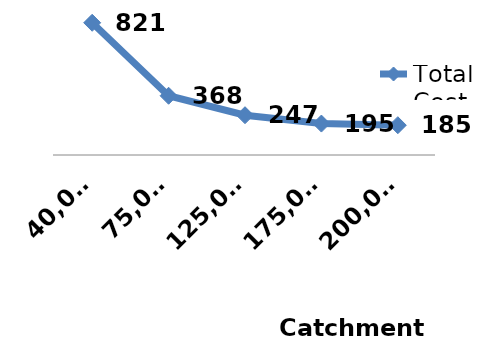
| Category | Total Cost (PKR) |
|---|---|
| 40,000 | 820.82 |
| 75,000 | 367.699 |
| 125,000 | 246.866 |
| 175,000 | 195.081 |
| 200,000 | 184.86 |